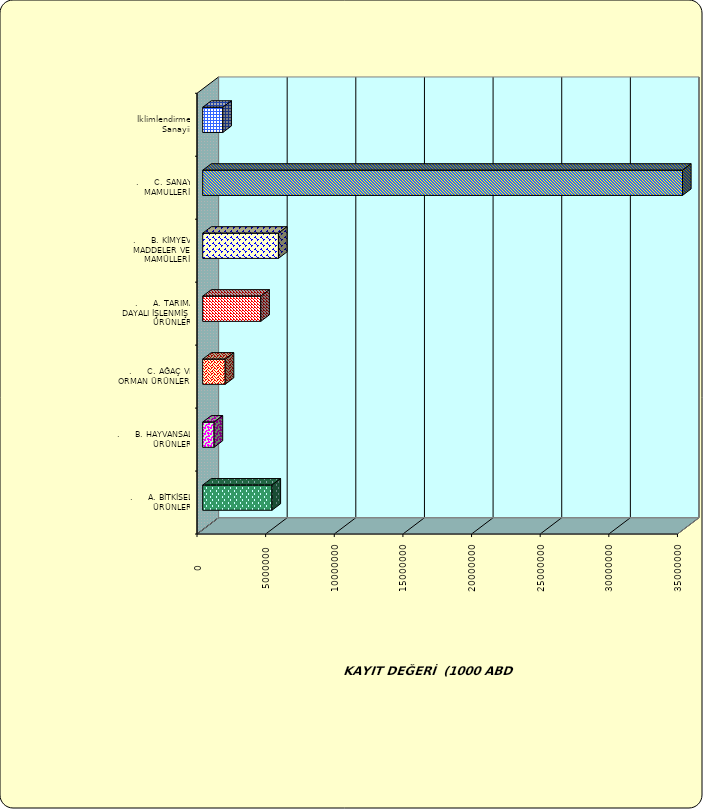
| Category | Series 0 |
|---|---|
| .     A. BİTKİSEL ÜRÜNLER | 5047329.378 |
| .     B. HAYVANSAL ÜRÜNLER | 829525.784 |
| .     C. AĞAÇ VE ORMAN ÜRÜNLERİ | 1638849.926 |
| .     A. TARIMA DAYALI İŞLENMİŞ ÜRÜNLER | 4232165.317 |
| .     B. KİMYEVİ MADDELER VE MAMÜLLERİ | 5518470.789 |
| .     C. SANAYİ MAMULLERİ | 34952596.808 |
|  İklimlendirme Sanayii | 1466652.976 |